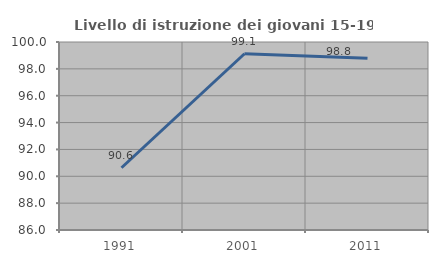
| Category | Livello di istruzione dei giovani 15-19 anni |
|---|---|
| 1991.0 | 90.637 |
| 2001.0 | 99.127 |
| 2011.0 | 98.795 |